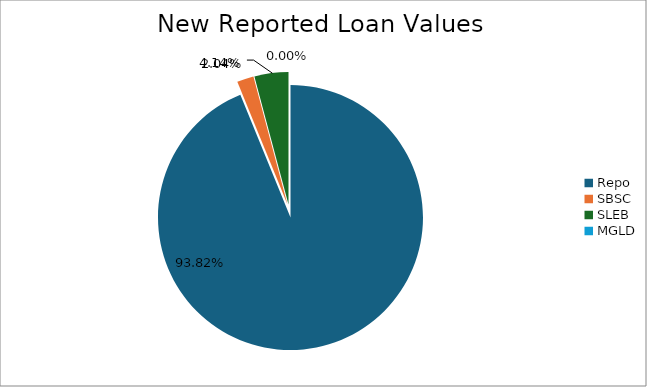
| Category | Series 0 |
|---|---|
| Repo | 11181331.955 |
| SBSC | 242899.835 |
| SLEB | 493552.956 |
| MGLD | 174.211 |